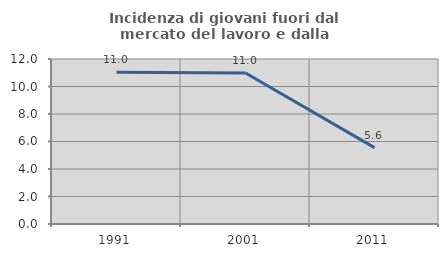
| Category | Incidenza di giovani fuori dal mercato del lavoro e dalla formazione  |
|---|---|
| 1991.0 | 11.031 |
| 2001.0 | 10.984 |
| 2011.0 | 5.556 |